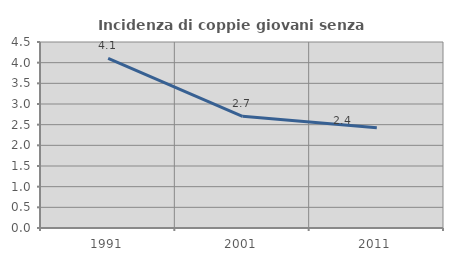
| Category | Incidenza di coppie giovani senza figli |
|---|---|
| 1991.0 | 4.103 |
| 2001.0 | 2.703 |
| 2011.0 | 2.424 |